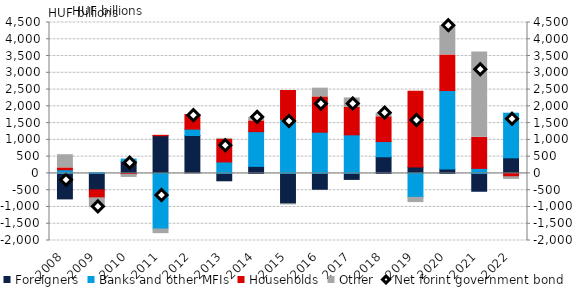
| Category | Foreigners | Banks and other MFIs | Households | Other |
|---|---|---|---|---|
| 2008.0 | -759.65 | 107.753 | 57.047 | 392.2 |
| 2009.0 | -491.4 | 23.556 | -236.156 | -293.241 |
| 2010.0 | 358.869 | 68.381 | -32.221 | -87.487 |
| 2011.0 | 1124.084 | -1656.51 | 11.985 | -139.476 |
| 2012.0 | 1130.805 | 189.835 | 433.858 | -29.175 |
| 2013.0 | -219.704 | 342.911 | 675.773 | 24.837 |
| 2014.0 | 209.723 | 1035.767 | 320.976 | 103.968 |
| 2015.0 | -901.505 | 1614.165 | 857.987 | -21.991 |
| 2016.0 | -472.926 | 1229.477 | 1051.766 | 261.126 |
| 2017.0 | -178.442 | 1151.054 | 813.833 | 286.152 |
| 2018.0 | 495.598 | 454.326 | 738.809 | 106.89 |
| 2019.0 | 191.648 | -715.225 | 2258.289 | -154.593 |
| 2020.0 | 130.571 | 2340.032 | 1061.422 | 872.127 |
| 2021.0 | -531.78 | 150.168 | 927.345 | 2545.472 |
| 2022.0 | 464.349 | 1330.955 | -99.014 | -80.043 |